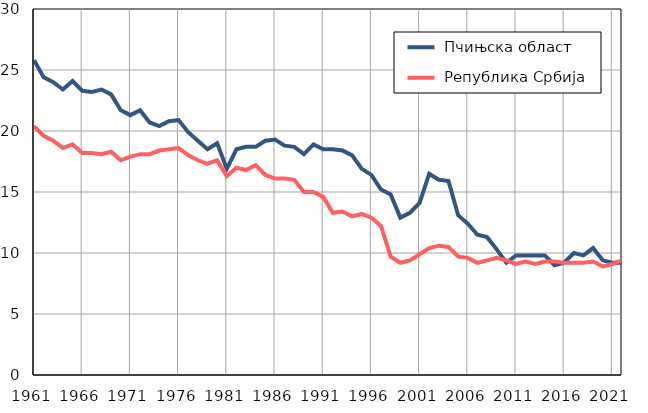
| Category |  Пчињска област |  Република Србија |
|---|---|---|
| 1961.0 | 25.8 | 20.4 |
| 1962.0 | 24.4 | 19.6 |
| 1963.0 | 24 | 19.2 |
| 1964.0 | 23.4 | 18.6 |
| 1965.0 | 24.1 | 18.9 |
| 1966.0 | 23.3 | 18.2 |
| 1967.0 | 23.2 | 18.2 |
| 1968.0 | 23.4 | 18.1 |
| 1969.0 | 23 | 18.3 |
| 1970.0 | 21.7 | 17.6 |
| 1971.0 | 21.3 | 17.9 |
| 1972.0 | 21.7 | 18.1 |
| 1973.0 | 20.7 | 18.1 |
| 1974.0 | 20.4 | 18.4 |
| 1975.0 | 20.8 | 18.5 |
| 1976.0 | 20.9 | 18.6 |
| 1977.0 | 19.9 | 18 |
| 1978.0 | 19.2 | 17.6 |
| 1979.0 | 18.5 | 17.3 |
| 1980.0 | 19 | 17.6 |
| 1981.0 | 16.9 | 16.3 |
| 1982.0 | 18.5 | 17 |
| 1983.0 | 18.7 | 16.8 |
| 1984.0 | 18.7 | 17.2 |
| 1985.0 | 19.2 | 16.4 |
| 1986.0 | 19.3 | 16.1 |
| 1987.0 | 18.8 | 16.1 |
| 1988.0 | 18.7 | 16 |
| 1989.0 | 18.1 | 15 |
| 1990.0 | 18.9 | 15 |
| 1991.0 | 18.5 | 14.6 |
| 1992.0 | 18.5 | 13.3 |
| 1993.0 | 18.4 | 13.4 |
| 1994.0 | 18 | 13 |
| 1995.0 | 16.9 | 13.2 |
| 1996.0 | 16.4 | 12.9 |
| 1997.0 | 15.2 | 12.2 |
| 1998.0 | 14.8 | 9.7 |
| 1999.0 | 12.9 | 9.2 |
| 2000.0 | 13.3 | 9.4 |
| 2001.0 | 14.1 | 9.9 |
| 2002.0 | 16.5 | 10.4 |
| 2003.0 | 16 | 10.6 |
| 2004.0 | 15.9 | 10.5 |
| 2005.0 | 13.1 | 9.7 |
| 2006.0 | 12.4 | 9.6 |
| 2007.0 | 11.5 | 9.2 |
| 2008.0 | 11.3 | 9.4 |
| 2009.0 | 10.3 | 9.6 |
| 2010.0 | 9.2 | 9.4 |
| 2011.0 | 9.8 | 9.1 |
| 2012.0 | 9.8 | 9.3 |
| 2013.0 | 9.8 | 9.1 |
| 2014.0 | 9.8 | 9.3 |
| 2015.0 | 9 | 9.3 |
| 2016.0 | 9.2 | 9.2 |
| 2017.0 | 10 | 9.2 |
| 2018.0 | 9.8 | 9.2 |
| 2019.0 | 10.4 | 9.3 |
| 2020.0 | 9.4 | 8.9 |
| 2021.0 | 9.2 | 9.1 |
| 2022.0 | 9.2 | 9.4 |